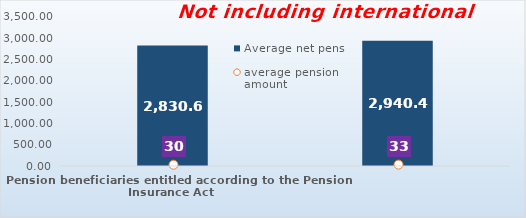
| Category | Average net pension  |
|---|---|
| Pension beneficiaries entitled according to the Pension Insurance Act   | 2830.65 |
| Pension beneficiaries entitled to pension FOR THE FIRST TIME in 2020 according to the Pension Insurance Act  - NEW BENEFICIARIES | 2940.473 |